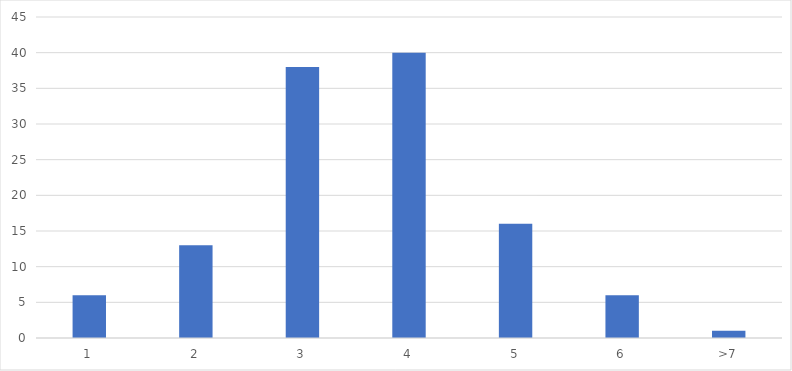
| Category | Number of Responses |
|---|---|
| 1 | 6 |
| 2 | 13 |
| 3 | 38 |
| 4 | 40 |
| 5 | 16 |
| 6 | 6 |
| >7 | 1 |